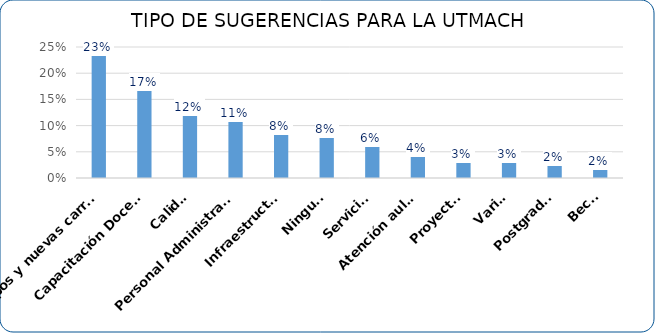
| Category | Cupos y nuevas carreras |
|---|---|
| Cupos y nuevas carreras | 0.235 |
| Capacitación Docente | 0.169 |
| Calidad | 0.12 |
| Personal Administrativo | 0.108 |
| Infraestructura | 0.084 |
| Ninguna | 0.078 |
| Servicios | 0.06 |
| Atención aulas | 0.042 |
| Proyectos | 0.03 |
| Varios | 0.03 |
| Postgrados | 0.024 |
| Becas | 0.018 |